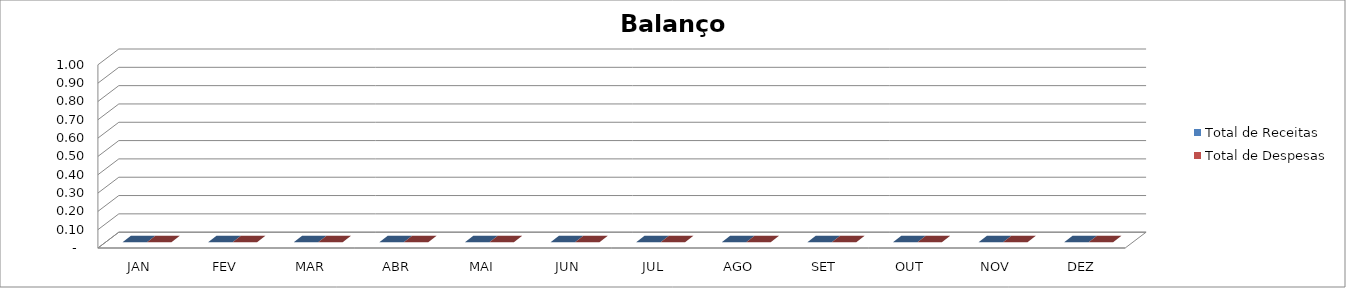
| Category | Total de Receitas | Total de Despesas |
|---|---|---|
| JAN | 0 | 0 |
| FEV | 0 | 0 |
| MAR | 0 | 0 |
| ABR | 0 | 0 |
| MAI | 0 | 0 |
| JUN | 0 | 0 |
| JUL | 0 | 0 |
| AGO | 0 | 0 |
| SET | 0 | 0 |
| OUT | 0 | 0 |
| NOV | 0 | 0 |
| DEZ | 0 | 0 |